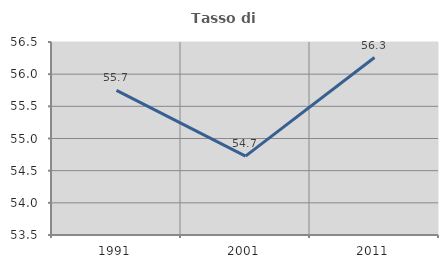
| Category | Tasso di occupazione   |
|---|---|
| 1991.0 | 55.748 |
| 2001.0 | 54.725 |
| 2011.0 | 56.258 |